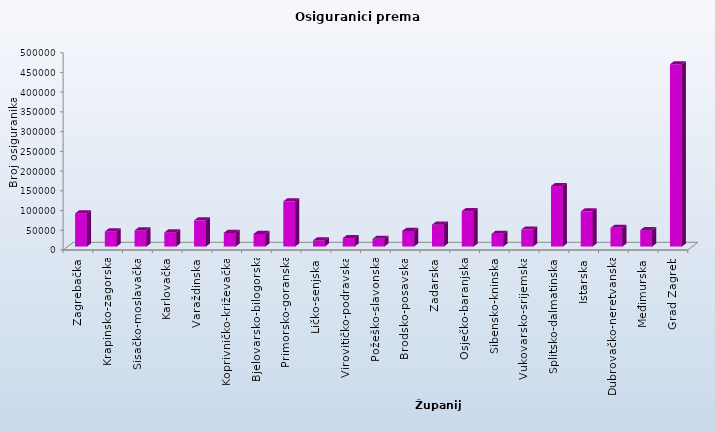
| Category | Series 0 |
|---|---|
| Zagrebačka | 83935 |
| Krapinsko-zagorska | 38267 |
| Sisačko-moslavačka | 40920 |
| Karlovačka | 35870 |
| Varaždinska | 66368 |
| Koprivničko-križevačka | 34609 |
| Bjelovarsko-bilogorska | 31934 |
| Primorsko-goranska | 114601 |
| Ličko-senjska | 15570 |
| Virovitičko-podravska | 21452 |
| Požeško-slavonska | 19593 |
| Brodsko-posavska | 39634 |
| Zadarska | 55506 |
| Osječko-baranjska | 89852 |
| Šibensko-kninska | 32266 |
| Vukovarsko-srijemska | 43100 |
| Splitsko-dalmatinska | 153289 |
| Istarska | 89204 |
| Dubrovačko-neretvanska | 47322 |
| Međimurska | 41569 |
| Grad Zagreb | 461965 |